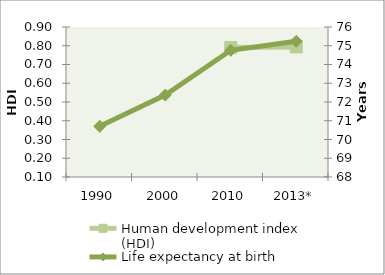
| Category | Human development index (HDI) |
|---|---|
| 1990 | 0 |
| 2000 | 0 |
| 2010 | 0.791 |
| 2013* | 0.794 |